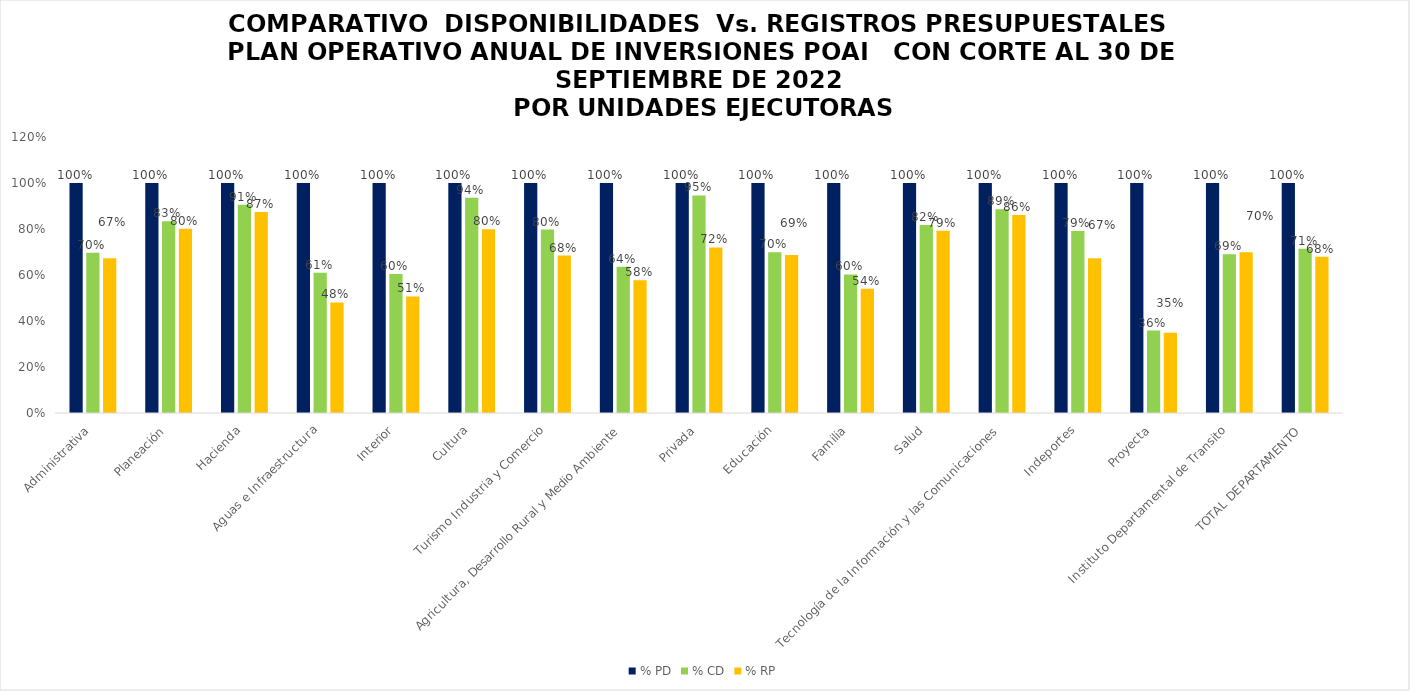
| Category | % PD | % CD | % RP |
|---|---|---|---|
| Administrativa | 1 | 0.697 | 0.672 |
| Planeación | 1 | 0.834 | 0.801 |
| Hacienda | 1 | 0.905 | 0.874 |
| Aguas e Infraestructura | 1 | 0.61 | 0.481 |
| Interior | 1 | 0.604 | 0.507 |
| Cultura | 1 | 0.936 | 0.799 |
| Turismo Industria y Comercio | 1 | 0.798 | 0.684 |
| Agricultura, Desarrollo Rural y Medio Ambiente | 1 | 0.636 | 0.577 |
| Privada | 1 | 0.946 | 0.72 |
| Educación | 1 | 0.698 | 0.687 |
| Familia | 1 | 0.602 | 0.54 |
| Salud | 1 | 0.817 | 0.792 |
| Tecnología de la Información y las Comunicaciones | 1 | 0.886 | 0.861 |
| Indeportes | 1 | 0.791 | 0.673 |
| Proyecta | 1 | 0.359 | 0.349 |
| Instituto Departamental de Transito | 1 | 0.69 | 0.699 |
| TOTAL DEPARTAMENTO | 1 | 0.714 | 0.679 |